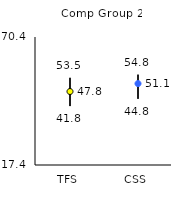
| Category | 25th | 75th | Mean |
|---|---|---|---|
| TFS | 41.8 | 53.5 | 47.83 |
| CSS | 44.8 | 54.8 | 51.11 |